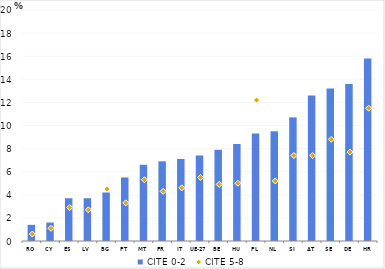
| Category | CITE 0-2 |
|---|---|
| RO | 1.4 |
| CY | 1.6 |
| ES | 3.7 |
| LV | 3.7 |
| BG | 4.2 |
| PT | 5.5 |
| MT | 6.6 |
| FR | 6.9 |
| IT | 7.1 |
| UE-27 | 7.4 |
| BE | 7.9 |
| HU | 8.4 |
| PL | 9.3 |
| NL | 9.5 |
| SI | 10.7 |
| AT | 12.6 |
| SE | 13.2 |
| DE | 13.6 |
| HR | 15.8 |